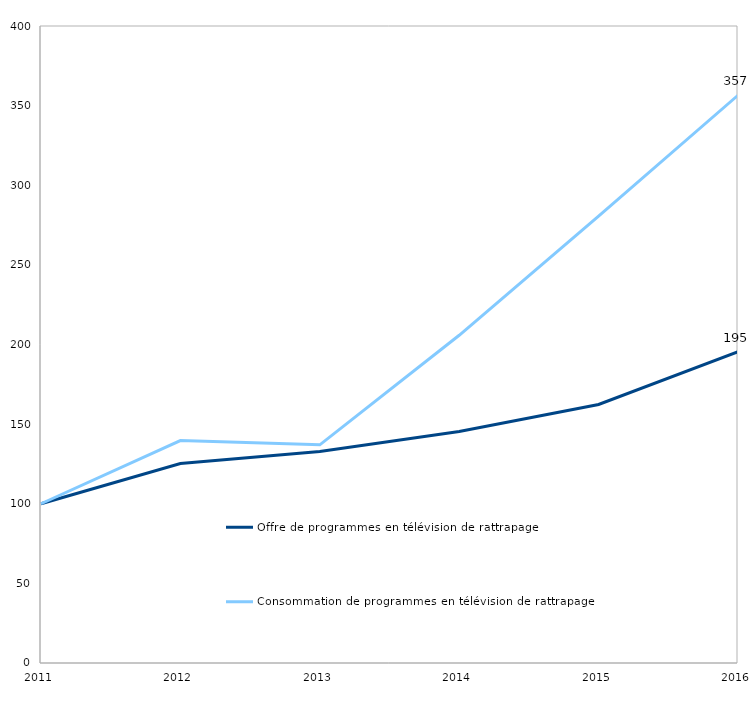
| Category | Offre de programmes en télévision de rattrapage | Consommation de programmes en télévision de rattrapage |
|---|---|---|
| 2011.0 | 100 | 100 |
| 2012.0 | 125.278 | 139.655 |
| 2013.0 | 132.84 | 137.012 |
| 2014.0 | 145.308 | 205.782 |
| 2015.0 | 162.34 | 280.595 |
| 2016.0 | 195.436 | 356.516 |